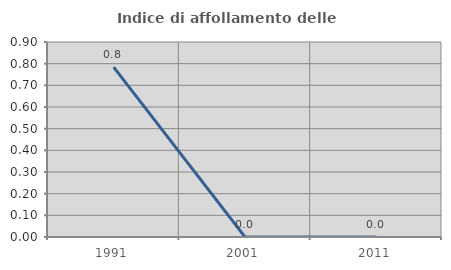
| Category | Indice di affollamento delle abitazioni  |
|---|---|
| 1991.0 | 0.784 |
| 2001.0 | 0 |
| 2011.0 | 0 |